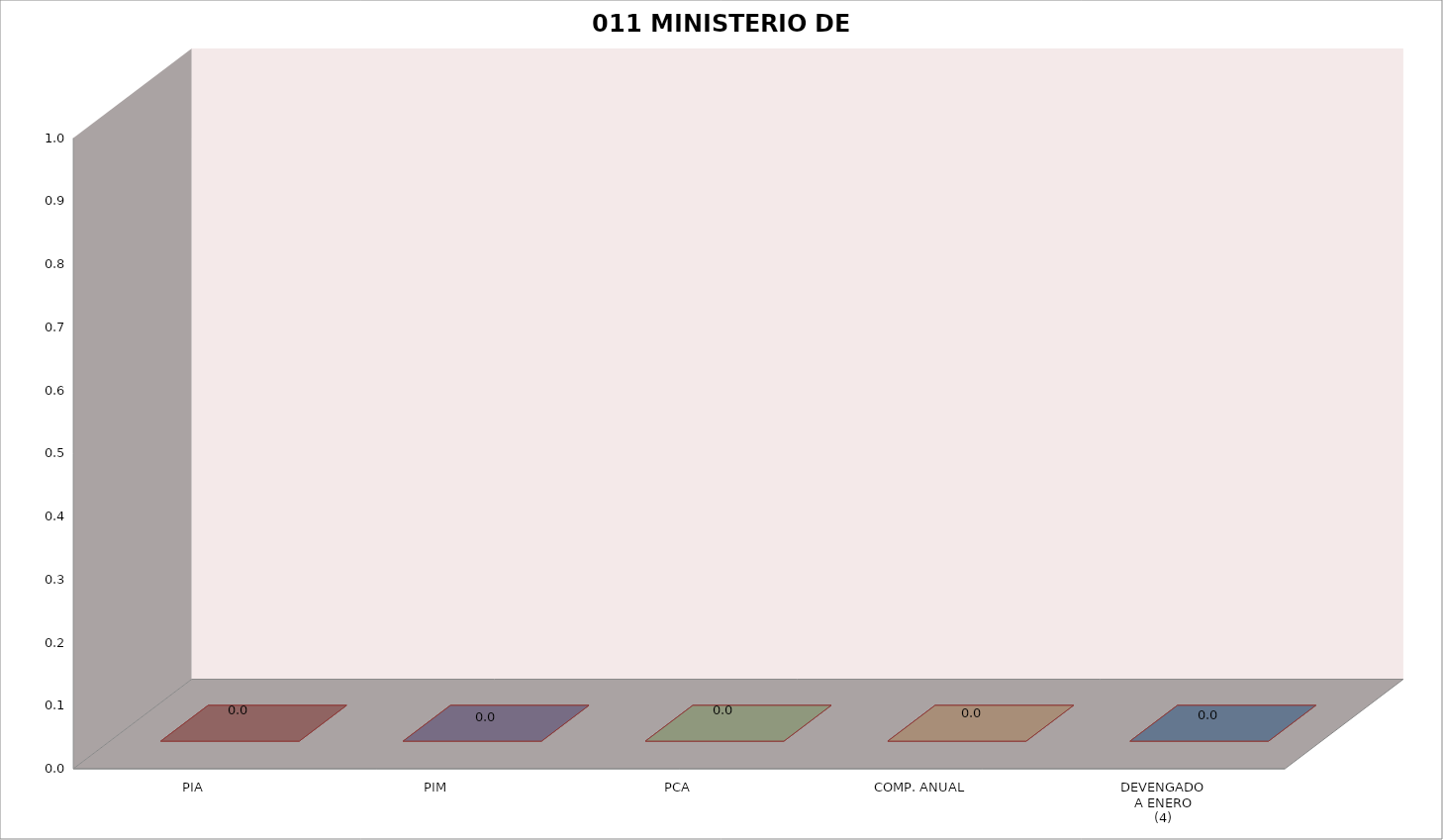
| Category | 011 MINISTERIO DE SALUD |
|---|---|
| PIA | 0 |
| PIM | 0 |
| PCA | 0 |
| COMP. ANUAL | 0 |
| DEVENGADO
A ENERO
(4) | 0 |